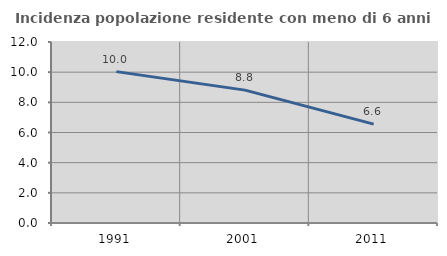
| Category | Incidenza popolazione residente con meno di 6 anni |
|---|---|
| 1991.0 | 10.035 |
| 2001.0 | 8.81 |
| 2011.0 | 6.555 |